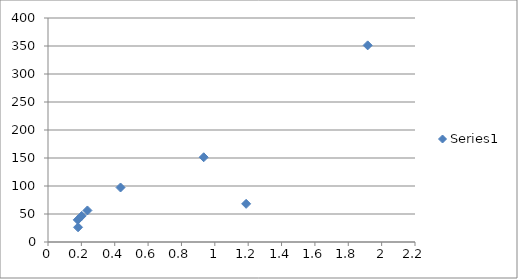
| Category | Series 0 |
|---|---|
| 0.1783562296 | 39.564 |
| 0.1800739333 | 26.304 |
| 0.2023284517 | 46.638 |
| 0.2363361784 | 56.307 |
| 0.4347249805 | 97.34 |
| 0.9334368611 | 151.322 |
| 1.187819058 | 68.16 |
| 1.916281886 | 351.14 |